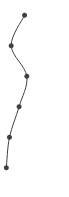
| Category | Series 0 |
|---|---|
| 0.30344555076202784 | 1 |
| 0.0837348972624951 | 2 |
| 0.34022033387932205 | 3 |
| 0.21313492969965092 | 4 |
| 0.05549023491875516 | 5 |
| 0.003928489882531615 | 6 |